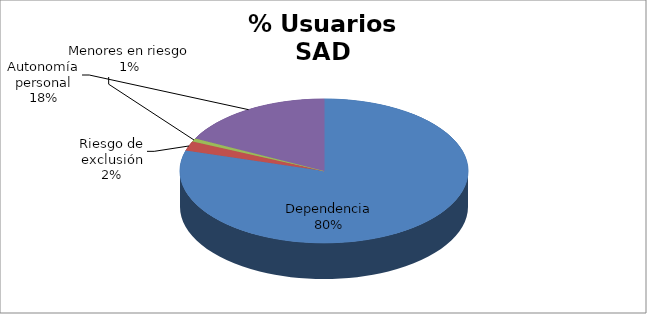
| Category | Series 0 |
|---|---|
| Dependencia | 3788 |
| Riesgo de exclusión | 102 |
| Menores en riesgo | 35 |
| Autonomía personal | 836 |